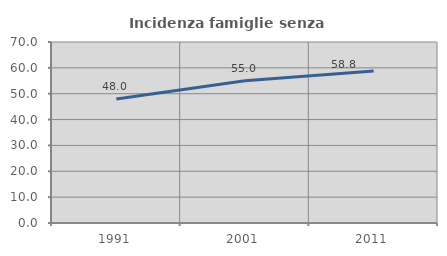
| Category | Incidenza famiglie senza nuclei |
|---|---|
| 1991.0 | 47.975 |
| 2001.0 | 55.019 |
| 2011.0 | 58.755 |